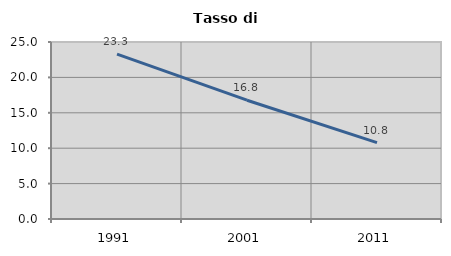
| Category | Tasso di disoccupazione   |
|---|---|
| 1991.0 | 23.293 |
| 2001.0 | 16.78 |
| 2011.0 | 10.787 |